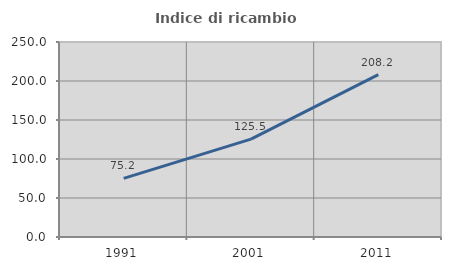
| Category | Indice di ricambio occupazionale  |
|---|---|
| 1991.0 | 75.177 |
| 2001.0 | 125.455 |
| 2011.0 | 208.247 |